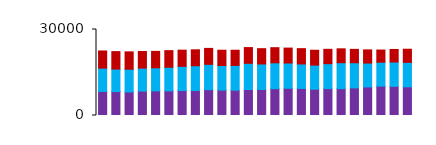
| Category | South |
|---|---|
| 0 | 5987 |
| 1 | 6085 |
| 2 | 6065 |
| 3 | 5802 |
| 4 | 5737 |
| 5 | 5804 |
| 6 | 5633 |
| 7 | 5559 |
| 8 | 5560 |
| 9 | 5337 |
| 10 | 5291 |
| 11 | 5493 |
| 12 | 5336 |
| 13 | 5271 |
| 14 | 5199 |
| 15 | 5342 |
| 16 | 5189 |
| 17 | 4997 |
| 18 | 4838 |
| 19 | 4663 |
| 20 | 4598 |
| 21 | 4246 |
| 22 | 4363 |
| 23 | 4571 |